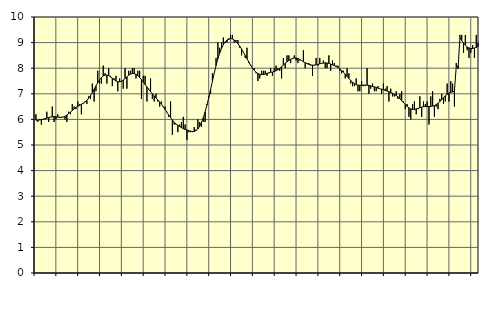
| Category | Piggar | Series 1 |
|---|---|---|
| nan | 6.2 | 5.97 |
| 1.0 | 5.9 | 5.97 |
| 1.0 | 6 | 5.98 |
| 1.0 | 5.8 | 5.99 |
| 1.0 | 6 | 6.01 |
| 1.0 | 6 | 6.03 |
| 1.0 | 6.3 | 6.05 |
| 1.0 | 5.9 | 6.07 |
| 1.0 | 6.1 | 6.09 |
| 1.0 | 6.5 | 6.1 |
| 1.0 | 5.9 | 6.11 |
| 1.0 | 6 | 6.1 |
| nan | 6.2 | 6.09 |
| 2.0 | 6.1 | 6.08 |
| 2.0 | 6.1 | 6.08 |
| 2.0 | 6.1 | 6.09 |
| 2.0 | 6 | 6.12 |
| 2.0 | 5.9 | 6.17 |
| 2.0 | 6.3 | 6.23 |
| 2.0 | 6.2 | 6.29 |
| 2.0 | 6.6 | 6.35 |
| 2.0 | 6.5 | 6.41 |
| 2.0 | 6.4 | 6.47 |
| 2.0 | 6.7 | 6.51 |
| nan | 6.6 | 6.55 |
| 3.0 | 6.2 | 6.59 |
| 3.0 | 6.6 | 6.63 |
| 3.0 | 6.7 | 6.68 |
| 3.0 | 6.6 | 6.74 |
| 3.0 | 6.9 | 6.83 |
| 3.0 | 6.8 | 6.93 |
| 3.0 | 7.4 | 7.05 |
| 3.0 | 6.7 | 7.18 |
| 3.0 | 7.1 | 7.31 |
| 3.0 | 7.9 | 7.43 |
| 3.0 | 7.4 | 7.54 |
| nan | 7.4 | 7.63 |
| 4.0 | 8.1 | 7.7 |
| 4.0 | 7.8 | 7.73 |
| 4.0 | 7.4 | 7.73 |
| 4.0 | 8 | 7.71 |
| 4.0 | 7.7 | 7.66 |
| 4.0 | 7.3 | 7.61 |
| 4.0 | 7.6 | 7.55 |
| 4.0 | 7.7 | 7.5 |
| 4.0 | 7.1 | 7.47 |
| 4.0 | 7.6 | 7.47 |
| 4.0 | 7.5 | 7.49 |
| nan | 7.2 | 7.54 |
| 5.0 | 8 | 7.6 |
| 5.0 | 7.2 | 7.66 |
| 5.0 | 7.9 | 7.73 |
| 5.0 | 7.9 | 7.77 |
| 5.0 | 8 | 7.79 |
| 5.0 | 8 | 7.79 |
| 5.0 | 7.6 | 7.76 |
| 5.0 | 7.9 | 7.71 |
| 5.0 | 7.9 | 7.64 |
| 5.0 | 6.8 | 7.55 |
| 5.0 | 7.7 | 7.46 |
| nan | 7.7 | 7.36 |
| 6.0 | 6.7 | 7.27 |
| 6.0 | 7.2 | 7.17 |
| 6.0 | 7.6 | 7.08 |
| 6.0 | 6.8 | 7 |
| 6.0 | 6.7 | 6.92 |
| 6.0 | 7 | 6.84 |
| 6.0 | 6.7 | 6.76 |
| 6.0 | 6.5 | 6.68 |
| 6.0 | 6.7 | 6.59 |
| 6.0 | 6.5 | 6.49 |
| 6.0 | 6.5 | 6.39 |
| nan | 6.3 | 6.28 |
| 7.0 | 6.1 | 6.17 |
| 7.0 | 6.7 | 6.07 |
| 7.0 | 5.4 | 5.98 |
| 7.0 | 5.8 | 5.89 |
| 7.0 | 5.8 | 5.82 |
| 7.0 | 5.5 | 5.77 |
| 7.0 | 5.8 | 5.72 |
| 7.0 | 5.9 | 5.68 |
| 7.0 | 6.1 | 5.64 |
| 7.0 | 5.8 | 5.61 |
| 7.0 | 5.2 | 5.59 |
| nan | 5.5 | 5.56 |
| 8.0 | 5.5 | 5.54 |
| 8.0 | 5.5 | 5.53 |
| 8.0 | 5.7 | 5.53 |
| 8.0 | 5.6 | 5.56 |
| 8.0 | 6 | 5.63 |
| 8.0 | 5.9 | 5.73 |
| 8.0 | 5.7 | 5.88 |
| 8.0 | 5.9 | 6.07 |
| 8.0 | 5.9 | 6.29 |
| 8.0 | 6.6 | 6.56 |
| 8.0 | 6.9 | 6.85 |
| nan | 7 | 7.17 |
| 9.0 | 7.8 | 7.49 |
| 9.0 | 7.8 | 7.81 |
| 9.0 | 8.4 | 8.1 |
| 9.0 | 9 | 8.37 |
| 9.0 | 8.8 | 8.59 |
| 9.0 | 9 | 8.77 |
| 9.0 | 9.2 | 8.92 |
| 9.0 | 9 | 9.03 |
| 9.0 | 9 | 9.1 |
| 9.0 | 9.1 | 9.15 |
| 9.0 | 9.3 | 9.16 |
| nan | 9.3 | 9.14 |
| 10.0 | 9 | 9.1 |
| 10.0 | 9.1 | 9.04 |
| 10.0 | 9.1 | 8.96 |
| 10.0 | 8.8 | 8.86 |
| 10.0 | 8.5 | 8.75 |
| 10.0 | 8.6 | 8.63 |
| 10.0 | 8.4 | 8.5 |
| 10.0 | 8.8 | 8.37 |
| 10.0 | 8.2 | 8.24 |
| 10.0 | 8.1 | 8.12 |
| 10.0 | 8 | 8.01 |
| nan | 8 | 7.92 |
| 11.0 | 7.8 | 7.84 |
| 11.0 | 7.5 | 7.79 |
| 11.0 | 7.6 | 7.76 |
| 11.0 | 7.9 | 7.75 |
| 11.0 | 7.9 | 7.75 |
| 11.0 | 7.9 | 7.77 |
| 11.0 | 7.7 | 7.8 |
| 11.0 | 7.8 | 7.82 |
| 11.0 | 8 | 7.84 |
| 11.0 | 7.7 | 7.85 |
| 11.0 | 8 | 7.87 |
| nan | 8.1 | 7.9 |
| 12.0 | 8 | 7.94 |
| 12.0 | 7.9 | 7.99 |
| 12.0 | 7.6 | 8.06 |
| 12.0 | 8.4 | 8.12 |
| 12.0 | 8 | 8.19 |
| 12.0 | 8.5 | 8.25 |
| 12.0 | 8.5 | 8.3 |
| 12.0 | 8.2 | 8.35 |
| 12.0 | 8.4 | 8.38 |
| 12.0 | 8.5 | 8.4 |
| 12.0 | 8.3 | 8.4 |
| nan | 8.2 | 8.38 |
| 13.0 | 8.3 | 8.34 |
| 13.0 | 8.3 | 8.3 |
| 13.0 | 8.7 | 8.25 |
| 13.0 | 8 | 8.21 |
| 13.0 | 8.2 | 8.18 |
| 13.0 | 8.2 | 8.15 |
| 13.0 | 8.1 | 8.13 |
| 13.0 | 7.7 | 8.12 |
| 13.0 | 8.1 | 8.12 |
| 13.0 | 8.4 | 8.13 |
| 13.0 | 8.1 | 8.15 |
| nan | 8.4 | 8.17 |
| 14.0 | 8.2 | 8.19 |
| 14.0 | 8.3 | 8.2 |
| 14.0 | 8 | 8.21 |
| 14.0 | 8 | 8.2 |
| 14.0 | 8.5 | 8.19 |
| 14.0 | 7.9 | 8.16 |
| 14.0 | 8.3 | 8.13 |
| 14.0 | 8.2 | 8.1 |
| 14.0 | 8.1 | 8.07 |
| 14.0 | 8.1 | 8.03 |
| 14.0 | 7.9 | 7.97 |
| nan | 7.8 | 7.91 |
| 15.0 | 7.9 | 7.84 |
| 15.0 | 7.6 | 7.77 |
| 15.0 | 8 | 7.68 |
| 15.0 | 7.8 | 7.6 |
| 15.0 | 7.4 | 7.52 |
| 15.0 | 7.3 | 7.45 |
| 15.0 | 7.3 | 7.4 |
| 15.0 | 7.6 | 7.36 |
| 15.0 | 7.1 | 7.34 |
| 15.0 | 7.1 | 7.33 |
| 15.0 | 7.5 | 7.33 |
| nan | 7.3 | 7.34 |
| 16.0 | 7.3 | 7.34 |
| 16.0 | 8 | 7.34 |
| 16.0 | 7 | 7.33 |
| 16.0 | 7.2 | 7.31 |
| 16.0 | 7.4 | 7.29 |
| 16.0 | 7.1 | 7.27 |
| 16.0 | 7.1 | 7.25 |
| 16.0 | 7.3 | 7.22 |
| 16.0 | 7.2 | 7.2 |
| 16.0 | 7 | 7.18 |
| 16.0 | 7.4 | 7.16 |
| nan | 7.2 | 7.13 |
| 17.0 | 7.3 | 7.11 |
| 17.0 | 6.7 | 7.08 |
| 17.0 | 7.2 | 7.05 |
| 17.0 | 6.9 | 7.02 |
| 17.0 | 6.9 | 6.98 |
| 17.0 | 7.1 | 6.93 |
| 17.0 | 6.8 | 6.88 |
| 17.0 | 7 | 6.81 |
| 17.0 | 7.1 | 6.73 |
| 17.0 | 6.7 | 6.65 |
| 17.0 | 6.4 | 6.58 |
| nan | 6.6 | 6.51 |
| 18.0 | 6.1 | 6.45 |
| 18.0 | 6 | 6.41 |
| 18.0 | 6.6 | 6.39 |
| 18.0 | 6.7 | 6.39 |
| 18.0 | 6.2 | 6.41 |
| 18.0 | 6.4 | 6.43 |
| 18.0 | 6.9 | 6.46 |
| 18.0 | 6.1 | 6.48 |
| 18.0 | 6.7 | 6.5 |
| 18.0 | 6.6 | 6.5 |
| 18.0 | 6.7 | 6.5 |
| nan | 5.8 | 6.5 |
| 19.0 | 6.9 | 6.51 |
| 19.0 | 7.1 | 6.52 |
| 19.0 | 6.1 | 6.54 |
| 19.0 | 6.5 | 6.58 |
| 19.0 | 6.4 | 6.63 |
| 19.0 | 6.8 | 6.7 |
| 19.0 | 7 | 6.77 |
| 19.0 | 6.6 | 6.85 |
| 19.0 | 6.7 | 6.92 |
| 19.0 | 7.4 | 6.98 |
| 19.0 | 6.7 | 7.03 |
| nan | 7.5 | 7.06 |
| 20.0 | 7.4 | 7.07 |
| 20.0 | 6.5 | 7.11 |
| 20.0 | 8.2 | 8.07 |
| 20.0 | 8.1 | 7.99 |
| 20.0 | 9.3 | 9.19 |
| 20.0 | 9.3 | 9.08 |
| 20.0 | 8.6 | 8.98 |
| 20.0 | 9.3 | 8.9 |
| 20.0 | 8.7 | 8.83 |
| 20.0 | 8.4 | 8.79 |
| 20.0 | 8.6 | 8.77 |
| nan | 8.9 | 8.77 |
| 21.0 | 8.4 | 8.79 |
| 21.0 | 9.3 | 8.81 |
| 21.0 | 9 | 8.85 |